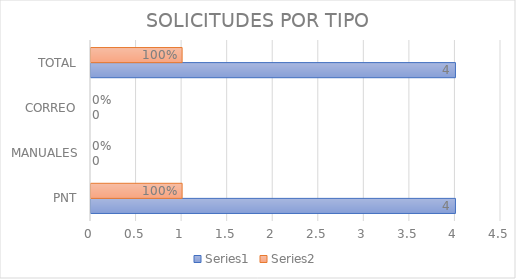
| Category | Series 0 | Series 1 |
|---|---|---|
| PNT | 4 | 1 |
| MANUALES | 0 | 0 |
| CORREO | 0 | 0 |
| TOTAL | 4 | 1 |